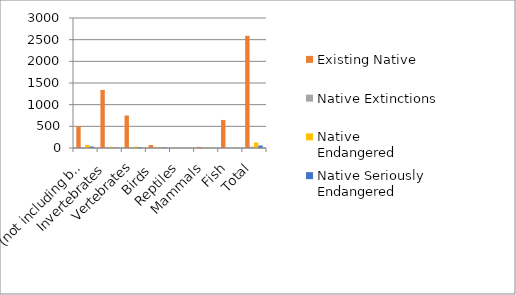
| Category | Existing Native  | Native Extinctions | Native Endangered | Native Seriously Endangered |
|---|---|---|---|---|
| Plants (not including bacteria or pathogens) | 498 | 4 | 68 | 35 |
| Invertebrates | 1341 | 16 | 27 | 7 |
| Vertebrates | 750 | 8 | 31 | 16 |
| Birds  | 70 | 8 | 20 | 13 |
| Reptiles | 5 | 0 | 4 | 3 |
| Mammals | 25 | 0 | 7 | 0 |
| Fish | 647 | 0 | 0 | 0 |
| Total | 2589 | 28 | 126 | 58 |